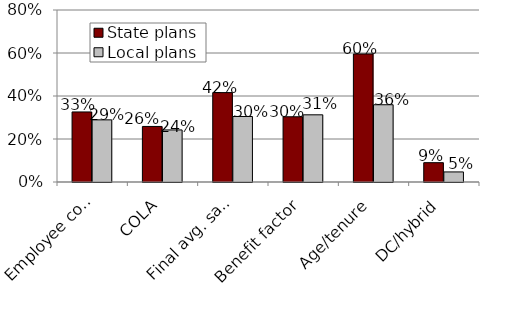
| Category | State plans | Local plans |
|---|---|---|
| Employee contributions | 0.326 | 0.289 |
| COLA | 0.258 | 0.242 |
| Final avg. salary | 0.416 | 0.305 |
| Benefit factor | 0.303 | 0.312 |
| Age/tenure | 0.596 | 0.359 |
| DC/hybrid | 0.09 | 0.047 |